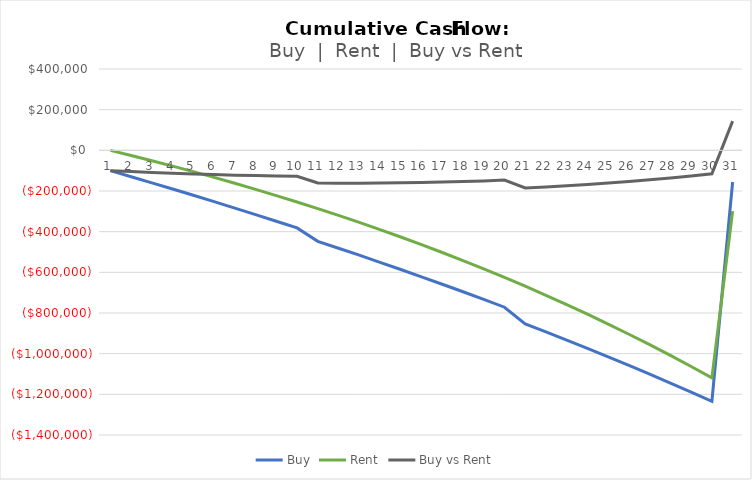
| Category | Buy | Rent | Buy vs Rent |
|---|---|---|---|
| 0 | -100000 | 0 | -100000 |
| 1 | -129721.081 | -25100 | -104621.081 |
| 2 | -159808.62 | -50930.41 | -108878.21 |
| 3 | -190273.409 | -77512.485 | -112760.924 |
| 4 | -221126.558 | -104868.098 | -116258.46 |
| 5 | -252379.507 | -133019.76 | -119359.747 |
| 6 | -284044.03 | -161990.635 | -122053.395 |
| 7 | -316132.25 | -191804.562 | -124327.687 |
| 8 | -348656.647 | -222486.075 | -126170.571 |
| 9 | -381630.068 | -254060.42 | -127569.648 |
| 10 | -447429.444 | -286553.578 | -160875.866 |
| 11 | -481340.985 | -319992.287 | -161348.698 |
| 12 | -515742.411 | -354404.063 | -161338.348 |
| 13 | -550648.154 | -389817.221 | -160830.933 |
| 14 | -586073.07 | -426260.902 | -159812.168 |
| 15 | -622032.455 | -463765.094 | -158267.36 |
| 16 | -658542.053 | -502360.659 | -156181.395 |
| 17 | -695618.075 | -542079.354 | -153538.722 |
| 18 | -733277.209 | -582953.863 | -150323.346 |
| 19 | -771536.635 | -625017.82 | -146518.814 |
| 20 | -853529.595 | -668305.839 | -185223.756 |
| 21 | -893043.185 | -712853.539 | -180189.646 |
| 22 | -933211.706 | -758697.577 | -174514.129 |
| 23 | -974054.457 | -805875.676 | -168178.78 |
| 24 | -1015591.304 | -854426.659 | -161164.645 |
| 25 | -1057842.699 | -904390.474 | -153452.225 |
| 26 | -1100829.7 | -955808.237 | -145021.463 |
| 27 | -1144573.983 | -1008722.257 | -135851.726 |
| 28 | -1189097.865 | -1063176.075 | -125921.79 |
| 29 | -1234424.32 | -1119214.498 | -115209.821 |
| 30 | -155798.975 | -299235.27 | 143436.294 |